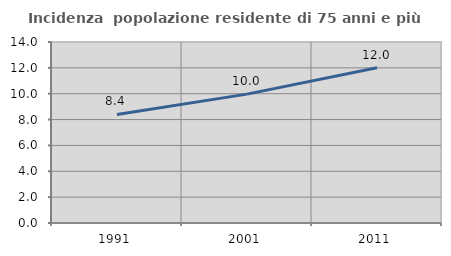
| Category | Incidenza  popolazione residente di 75 anni e più |
|---|---|
| 1991.0 | 8.397 |
| 2001.0 | 9.967 |
| 2011.0 | 12.005 |